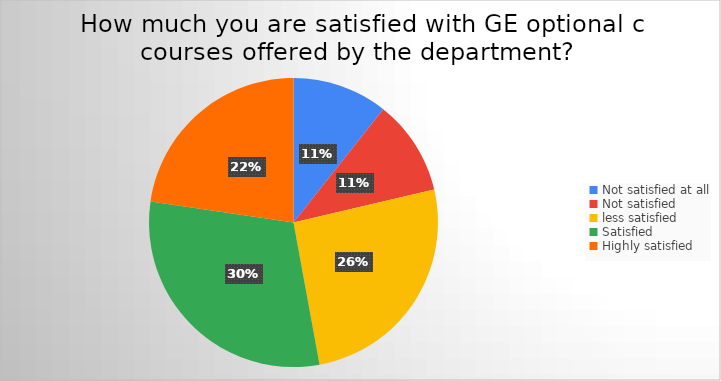
| Category | Series 0 |
|---|---|
| Not satisfied at all | 24 |
| Not satisfied  | 24 |
| less satisfied | 58 |
| Satisfied | 68 |
| Highly satisfied | 51 |